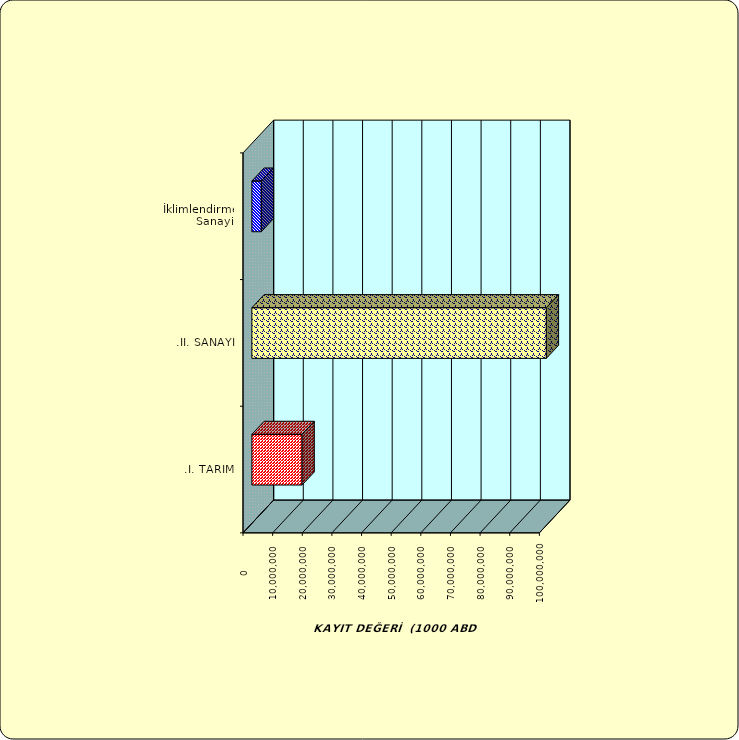
| Category | Series 0 |
|---|---|
| .I. TARIM | 16942521.044 |
| .II. SANAYİ | 99367690.83 |
|  İklimlendirme Sanayii | 3178034.916 |